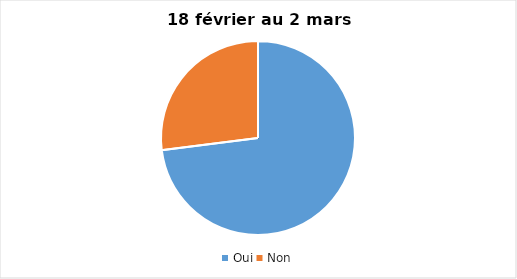
| Category | 18 février au 2 mars 2022 |
|---|---|
| Oui | 73 |
| Non | 27 |